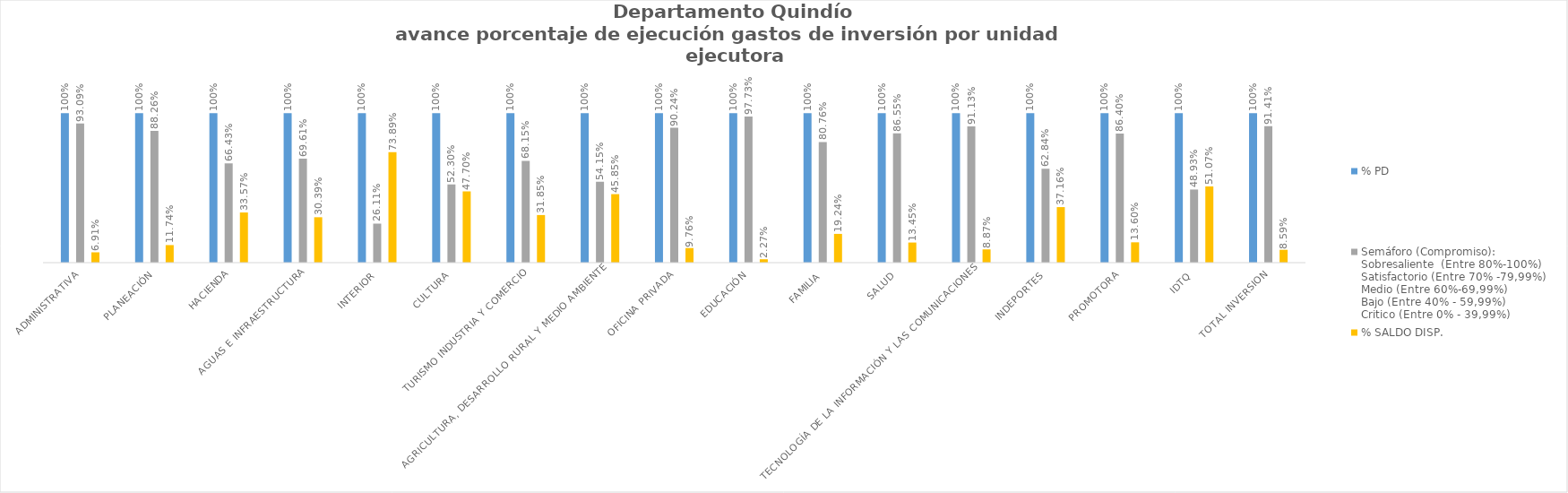
| Category | % PD | Semáforo (Compromiso):
Sobresaliente  (Entre 80%-100%)
Satisfactorio (Entre 70% -79,99%)
Medio (Entre 60%-69,99%)
Bajo (Entre 40% - 59,99%)
Critico (Entre 0% - 39,99%) | % SALDO DISP. |
|---|---|---|---|
| Administrativa | 1 | 0.931 | 0.069 |
| Planeación | 1 | 0.883 | 0.117 |
| Hacienda | 1 | 0.664 | 0.336 |
| Aguas e Infraestructura | 1 | 0.696 | 0.304 |
| Interior | 1 | 0.261 | 0.739 |
| Cultura | 1 | 0.523 | 0.477 |
| Turismo Industria y Comercio | 1 | 0.681 | 0.319 |
| Agricultura, Desarrollo Rural y Medio Ambiente | 1 | 0.542 | 0.458 |
| Oficina Privada | 1 | 0.902 | 0.098 |
| Educación | 1 | 0.977 | 0.023 |
| Familia | 1 | 0.808 | 0.192 |
| Salud | 1 | 0.865 | 0.135 |
| Tecnología de la Información y las Comunicaciones | 1 | 0.911 | 0.089 |
| Indeportes | 1 | 0.628 | 0.372 |
| Promotora | 1 | 0.864 | 0.136 |
| IDTQ | 1 | 0.489 | 0.511 |
| TOTAL INVERSION | 1 | 0.914 | 0.086 |